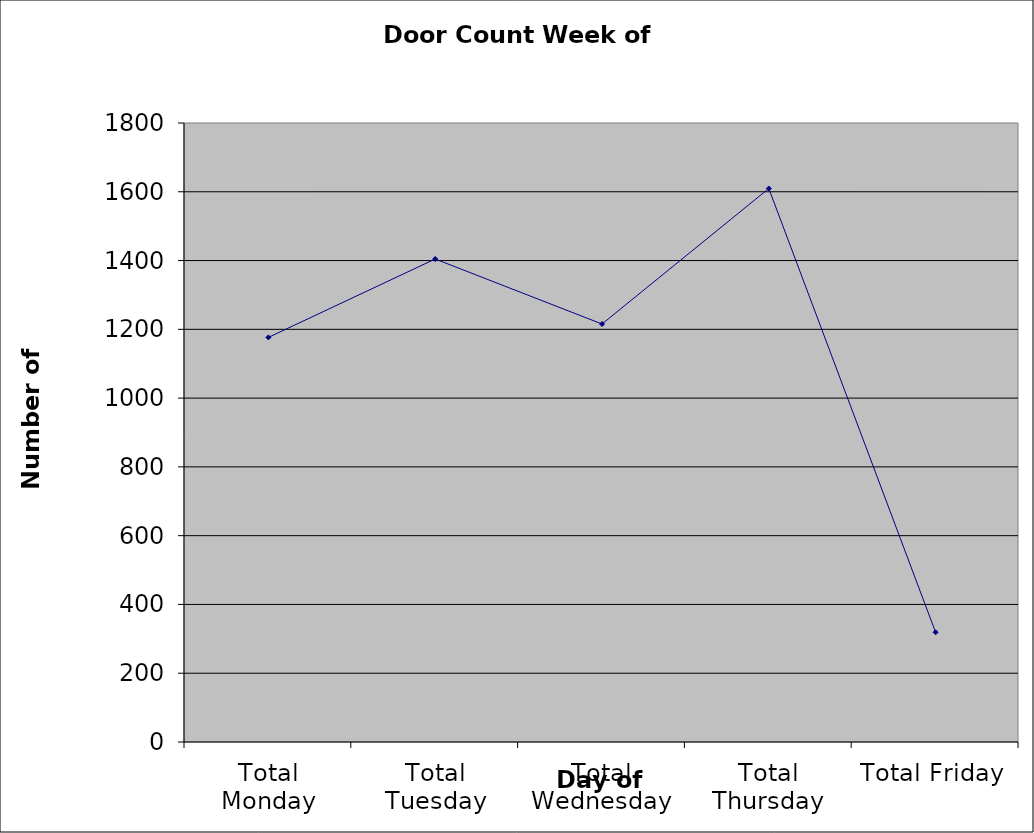
| Category | Series 0 |
|---|---|
| Total Monday | 1176.5 |
| Total Tuesday | 1404.5 |
| Total Wednesday | 1215.5 |
| Total Thursday | 1609.5 |
| Total Friday | 319 |